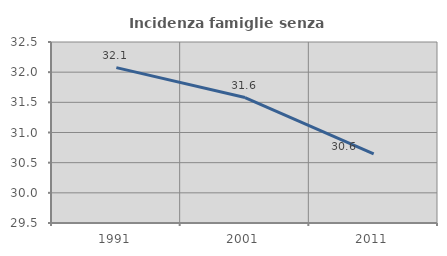
| Category | Incidenza famiglie senza nuclei |
|---|---|
| 1991.0 | 32.075 |
| 2001.0 | 31.579 |
| 2011.0 | 30.645 |